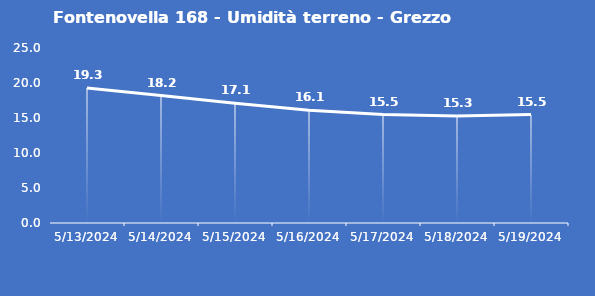
| Category | Fontenovella 168 - Umidità terreno - Grezzo (%VWC) |
|---|---|
| 5/13/24 | 19.3 |
| 5/14/24 | 18.2 |
| 5/15/24 | 17.1 |
| 5/16/24 | 16.1 |
| 5/17/24 | 15.5 |
| 5/18/24 | 15.3 |
| 5/19/24 | 15.5 |